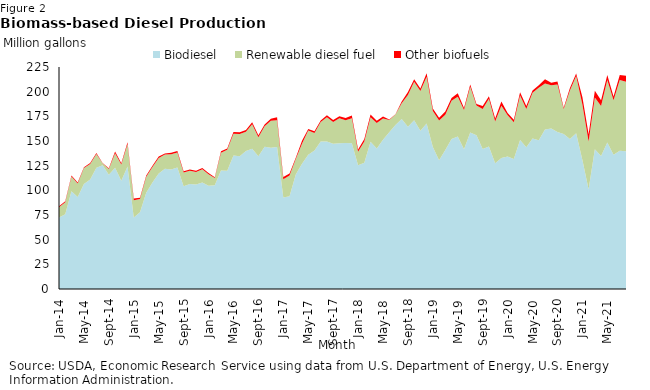
| Category | Biodiesel | Renewable diesel fuel | Other biofuels |
|---|---|---|---|
| 2014-01-01 | 72.54 | 10.329 | 0.928 |
| 2014-02-01 | 75.643 | 12.293 | 0.89 |
| 2014-03-01 | 99.178 | 14.953 | 1.007 |
| 2014-04-01 | 93.352 | 13.676 | 0.892 |
| 2014-05-01 | 106.314 | 16.219 | 0.937 |
| 2014-06-01 | 111.07 | 15.665 | 0.929 |
| 2014-07-01 | 122.887 | 13.998 | 1.065 |
| 2014-08-01 | 125.437 | 2.043 | 0.117 |
| 2014-09-01 | 115.677 | 5.949 | 0.701 |
| 2014-10-01 | 122.988 | 14.722 | 1.6 |
| 2014-11-01 | 109.639 | 16.463 | 1.366 |
| 2014-12-01 | 124.254 | 22.831 | 1.768 |
| 2015-01-01 | 72.546 | 17.505 | 1.771 |
| 2015-02-01 | 77.736 | 13.481 | 1.349 |
| 2015-03-01 | 97.673 | 16.11 | 1.138 |
| 2015-04-01 | 107.85 | 15.733 | 1.247 |
| 2015-05-01 | 116.94 | 15.741 | 1.508 |
| 2015-06-01 | 121.824 | 14.42 | 1.145 |
| 2015-07-01 | 121.076 | 15.521 | 1.571 |
| 2015-08-01 | 123.176 | 15.1 | 1.543 |
| 2015-09-01 | 104.119 | 13.846 | 1.415 |
| 2015-10-01 | 106.467 | 13.414 | 1.331 |
| 2015-11-01 | 105.883 | 12.656 | 1.244 |
| 2015-12-01 | 108.057 | 13.321 | 1.26 |
| 2016-01-01 | 104.576 | 11.758 | 1.26 |
| 2016-02-01 | 105.154 | 7.355 | 0.762 |
| 2016-03-01 | 120.159 | 17.925 | 1.515 |
| 2016-04-01 | 119.951 | 21.253 | 1.166 |
| 2016-05-01 | 135.344 | 21.933 | 1.828 |
| 2016-06-01 | 134.62 | 22.569 | 1.766 |
| 2016-07-01 | 139.887 | 19.52 | 1.643 |
| 2016-08-01 | 142.177 | 24.8 | 2.121 |
| 2016-09-01 | 134.667 | 19.215 | 1.901 |
| 2016-10-01 | 144.192 | 20.64 | 1.912 |
| 2016-11-01 | 143.152 | 27.361 | 2.139 |
| 2016-12-01 | 143.851 | 27.157 | 3.133 |
| 2017-01-01 | 92.757 | 18.561 | 2.115 |
| 2017-02-01 | 93.983 | 21.043 | 1.958 |
| 2017-03-01 | 115.973 | 15.857 | 1.238 |
| 2017-04-01 | 126.821 | 20.403 | 3.125 |
| 2017-05-01 | 136.181 | 24.393 | 1.491 |
| 2017-06-01 | 140.459 | 17.747 | 1.555 |
| 2017-07-01 | 149.513 | 19.652 | 1.595 |
| 2017-08-01 | 149.486 | 24.672 | 2.014 |
| 2017-09-01 | 147.293 | 21.967 | 2.063 |
| 2017-10-01 | 147.624 | 25.347 | 2.029 |
| 2017-11-01 | 147.98 | 23.177 | 2.063 |
| 2017-12-01 | 147.639 | 25.524 | 2.708 |
| 2018-01-01 | 125.525 | 13.681 | 2.158 |
| 2018-02-01 | 127.945 | 21.605 | 2.433 |
| 2018-03-01 | 149.127 | 25.068 | 2.731 |
| 2018-04-01 | 142.525 | 25.751 | 2.16 |
| 2018-05-01 | 151.312 | 21.508 | 2.029 |
| 2018-06-01 | 158.867 | 12.384 | 0.475 |
| 2018-07-01 | 166.331 | 10.554 | 0.144 |
| 2018-08-01 | 172.28 | 16.025 | 1.852 |
| 2018-09-01 | 164.396 | 32.248 | 2.982 |
| 2018-10-01 | 170.952 | 39.005 | 2.544 |
| 2018-11-01 | 160.273 | 40.325 | 2.72 |
| 2018-12-01 | 167.785 | 47.33 | 3.433 |
| 2019-01-01 | 143.917 | 36.487 | 2.494 |
| 2019-02-01 | 130.529 | 40.174 | 2.776 |
| 2019-03-01 | 140.825 | 35.74 | 3.378 |
| 2019-04-01 | 152.149 | 38.557 | 2.781 |
| 2019-05-01 | 154.59 | 40.383 | 3.389 |
| 2019-06-01 | 141.553 | 39.761 | 2.023 |
| 2019-07-01 | 158.61 | 46.282 | 2.443 |
| 2019-08-01 | 155.898 | 30.18 | 1.443 |
| 2019-09-01 | 141.846 | 40.692 | 2.915 |
| 2019-10-01 | 144.314 | 48.569 | 2.349 |
| 2019-11-01 | 127.424 | 42.389 | 2.869 |
| 2019-12-01 | 132.85 | 52.796 | 4.367 |
| 2020-01-01 | 134.233 | 41.857 | 2.328 |
| 2020-02-01 | 131.829 | 37.301 | 2.307 |
| 2020-03-01 | 150.945 | 45.227 | 3.155 |
| 2020-04-01 | 143.729 | 38.639 | 3.21 |
| 2020-05-01 | 152.48 | 46.421 | 2.365 |
| 2020-06-01 | 150.8 | 53.208 | 2.532 |
| 2020-07-01 | 161.669 | 46.684 | 4.127 |
| 2020-08-01 | 162.609 | 43.953 | 2.477 |
| 2020-09-01 | 159.161 | 48.113 | 3.065 |
| 2020-10-01 | 157.203 | 25.23 | 1.209 |
| 2020-11-01 | 152.067 | 49.054 | 2.603 |
| 2020-12-01 | 157.974 | 57.808 | 2.591 |
| 2021-01-01 | 130.83 | 56.07 | 7.602 |
| 2021-02-01 | 101.052 | 48.552 | 7.224 |
| 2021-03-01 | 141.6 | 52.504 | 6.922 |
| 2021-04-01 | 134.808 | 50.622 | 5.877 |
| 2021-05-01 | 148.56 | 63.141 | 5.313 |
| 2021-06-01 | 136.119 | 55.237 | 3.825 |
| 2021-07-01 | 140.125 | 71.648 | 5.245 |
| 2021-08-01 | 139.656 | 70.514 | 5.84 |